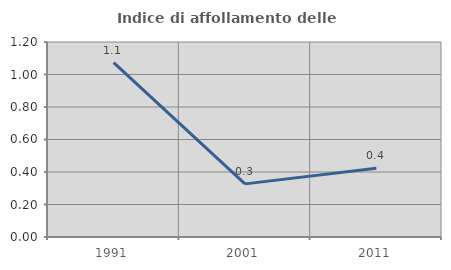
| Category | Indice di affollamento delle abitazioni  |
|---|---|
| 1991.0 | 1.074 |
| 2001.0 | 0.327 |
| 2011.0 | 0.423 |